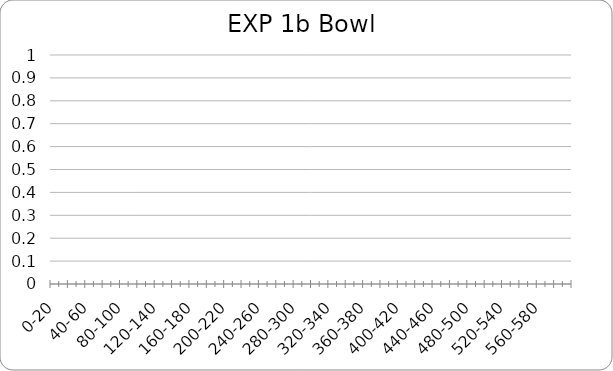
| Category | Series 0 |
|---|---|
| 0-20 | 0 |
| 20-40 | 0 |
| 40-60 | 0 |
| 60-80 | 0 |
| 80-100 | 0 |
| 100-120 | 0 |
| 120-140 | 0 |
| 140-160 | 0 |
| 160-180 | 0 |
| 180-200 | 0 |
| 200-220 | 0 |
| 220-240 | 0 |
| 240-260 | 0 |
| 260-280 | 0 |
| 280-300 | 0 |
| 300-320 | 0 |
| 320-340 | 0 |
| 340-360 | 0 |
| 360-380 | 0 |
| 380-400 | 0 |
| 400-420 | 0 |
| 420-440 | 0 |
| 440-460 | 0 |
| 460-480 | 0 |
| 480-500 | 0 |
| 500-520 | 0 |
| 520-540 | 0 |
| 540-560 | 0 |
| 560-580 | 0 |
| 580-600 | 0 |